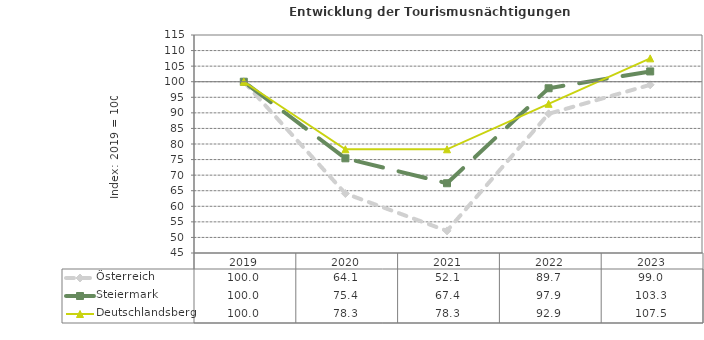
| Category | Österreich | Steiermark | Deutschlandsberg |
|---|---|---|---|
| 2023.0 | 99 | 103.3 | 107.5 |
| 2022.0 | 89.7 | 97.9 | 92.9 |
| 2021.0 | 52.1 | 67.4 | 78.3 |
| 2020.0 | 64.1 | 75.4 | 78.3 |
| 2019.0 | 100 | 100 | 100 |